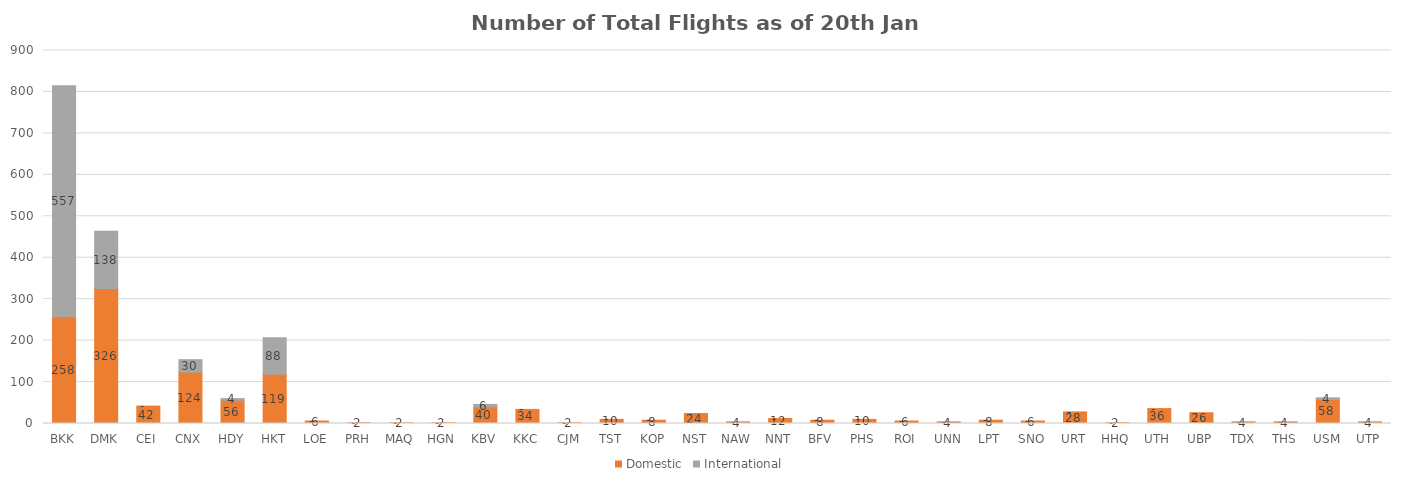
| Category | Domestic | International |
|---|---|---|
| BKK | 258 | 557 |
| DMK | 326 | 138 |
| CEI | 42 | 0 |
| CNX | 124 | 30 |
| HDY | 56 | 4 |
| HKT | 119 | 88 |
| LOE | 6 | 0 |
| PRH | 2 | 0 |
| MAQ | 2 | 0 |
| HGN | 2 | 0 |
| KBV | 40 | 6 |
| KKC | 34 | 0 |
| CJM | 2 | 0 |
| TST | 10 | 0 |
| KOP | 8 | 0 |
| NST | 24 | 0 |
| NAW | 4 | 0 |
| NNT | 12 | 0 |
| BFV | 8 | 0 |
| PHS | 10 | 0 |
| ROI | 6 | 0 |
| UNN | 4 | 0 |
| LPT | 8 | 0 |
| SNO | 6 | 0 |
| URT | 28 | 0 |
| HHQ | 2 | 0 |
| UTH | 36 | 0 |
| UBP | 26 | 0 |
| TDX | 4 | 0 |
| THS | 4 | 0 |
| USM | 58 | 4 |
| UTP | 4 | 0 |